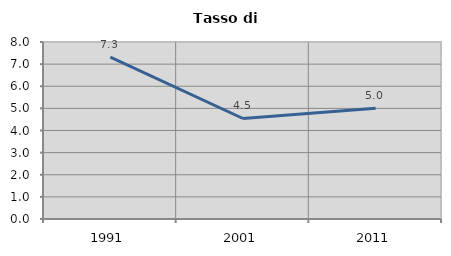
| Category | Tasso di disoccupazione   |
|---|---|
| 1991.0 | 7.313 |
| 2001.0 | 4.543 |
| 2011.0 | 5.01 |